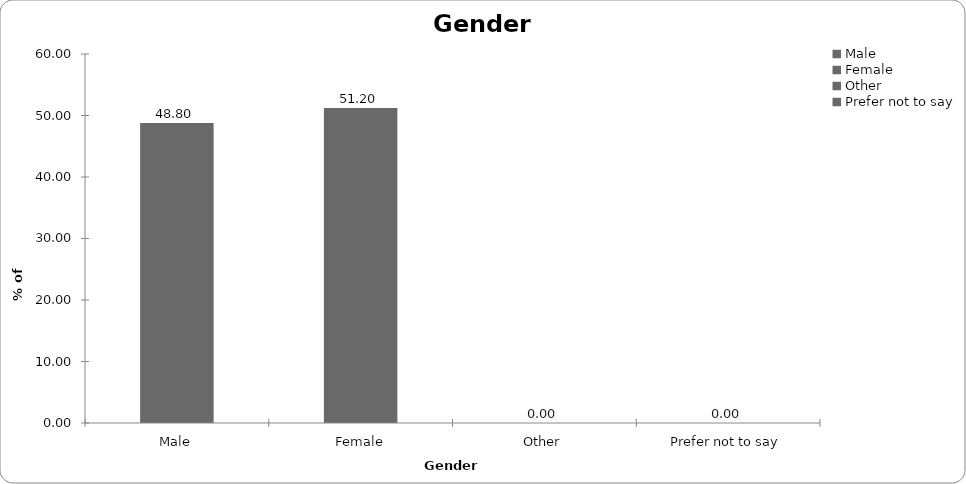
| Category | Series 0 |
|---|---|
| Male | 48.8 |
| Female | 51.2 |
| Other | 0 |
| Prefer not to say | 0 |